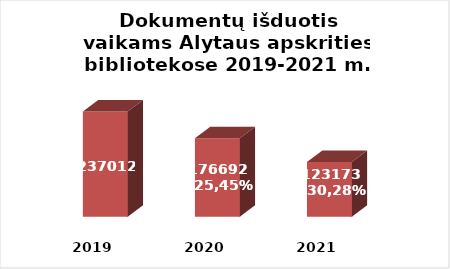
| Category | Series 0 |
|---|---|
| 2019.0 | 237012 |
| 2020.0 | 176692 |
| 2021.0 | 123173 |